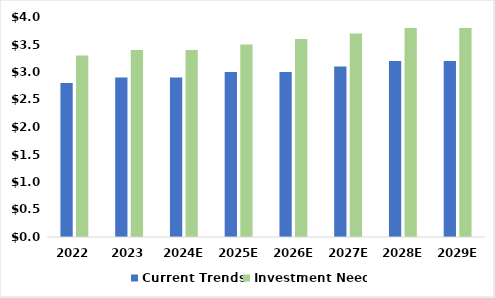
| Category | Current Trends | Investment Need |
|---|---|---|
| 2022 | 2.8 | 3.3 |
| 2023 | 2.9 | 3.4 |
| 2024E | 2.9 | 3.4 |
| 2025E | 3 | 3.5 |
| 2026E | 3 | 3.6 |
| 2027E | 3.1 | 3.7 |
| 2028E | 3.2 | 3.8 |
| 2029E | 3.2 | 3.8 |